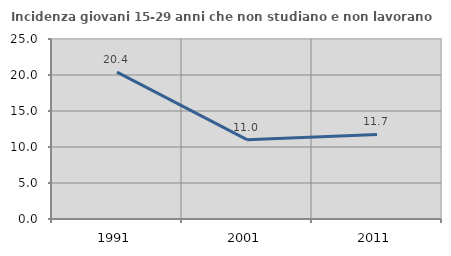
| Category | Incidenza giovani 15-29 anni che non studiano e non lavorano  |
|---|---|
| 1991.0 | 20.392 |
| 2001.0 | 11.017 |
| 2011.0 | 11.745 |